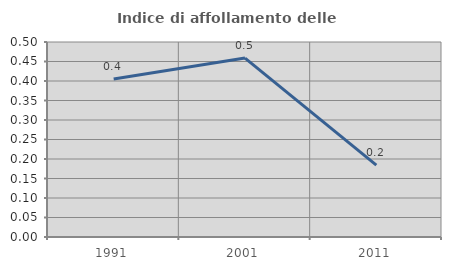
| Category | Indice di affollamento delle abitazioni  |
|---|---|
| 1991.0 | 0.405 |
| 2001.0 | 0.459 |
| 2011.0 | 0.184 |